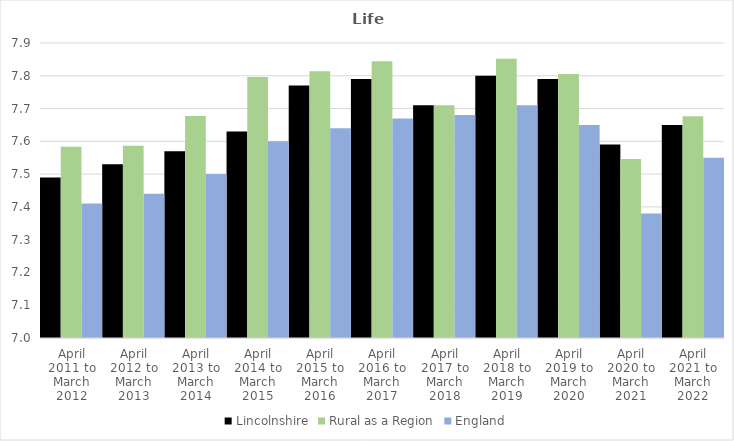
| Category | Lincolnshire | Rural as a Region | England |
|---|---|---|---|
| April 2011 to March 2012 | 7.49 | 7.584 | 7.41 |
| April 2012 to March 2013 | 7.53 | 7.586 | 7.44 |
| April 2013 to March 2014 | 7.57 | 7.677 | 7.5 |
| April 2014 to March 2015 | 7.63 | 7.797 | 7.6 |
| April 2015 to March 2016 | 7.77 | 7.813 | 7.64 |
| April 2016 to March 2017 | 7.79 | 7.845 | 7.67 |
| April 2017 to March 2018 | 7.71 | 7.71 | 7.68 |
| April 2018 to March 2019 | 7.8 | 7.852 | 7.71 |
| April 2019 to March 2020 | 7.79 | 7.806 | 7.65 |
| April 2020 to March 2021 | 7.59 | 7.546 | 7.38 |
| April 2021 to March 2022 | 7.65 | 7.677 | 7.55 |